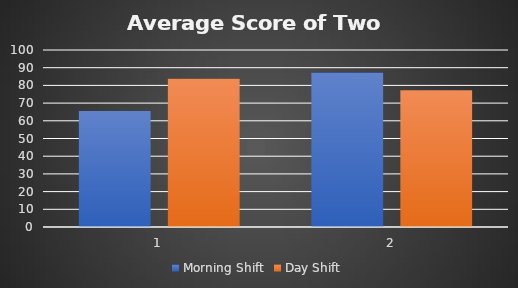
| Category | Morning Shift | Day Shift |
|---|---|---|
| 0 | 65.5 | 83.75 |
| 1 | 87.25 | 77.25 |